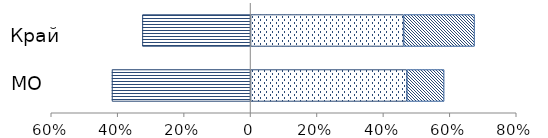
| Category | Ниже базового | Базовый | Повышенный |
|---|---|---|---|
|  | -0.417 | 0.471 | 0.112 |
|  | -0.326 | 0.461 | 0.214 |